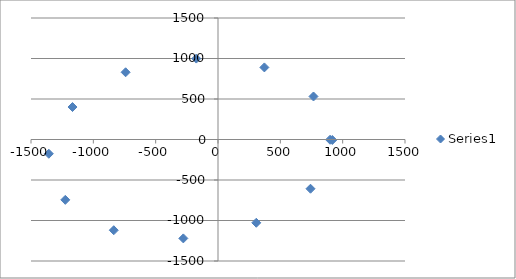
| Category | Series 0 |
|---|---|
| 917.0 | -6 |
| 742.0 | -608 |
| 307.0 | -1028 |
| -278.0 | -1221 |
| -836.0 | -1120 |
| -1225.0 | -745 |
| -1357.0 | -176 |
| -1167.0 | 401 |
| -741.0 | 830 |
| -174.0 | 999 |
| 372.0 | 890 |
| 766.0 | 531 |
| 899.0 | -3 |